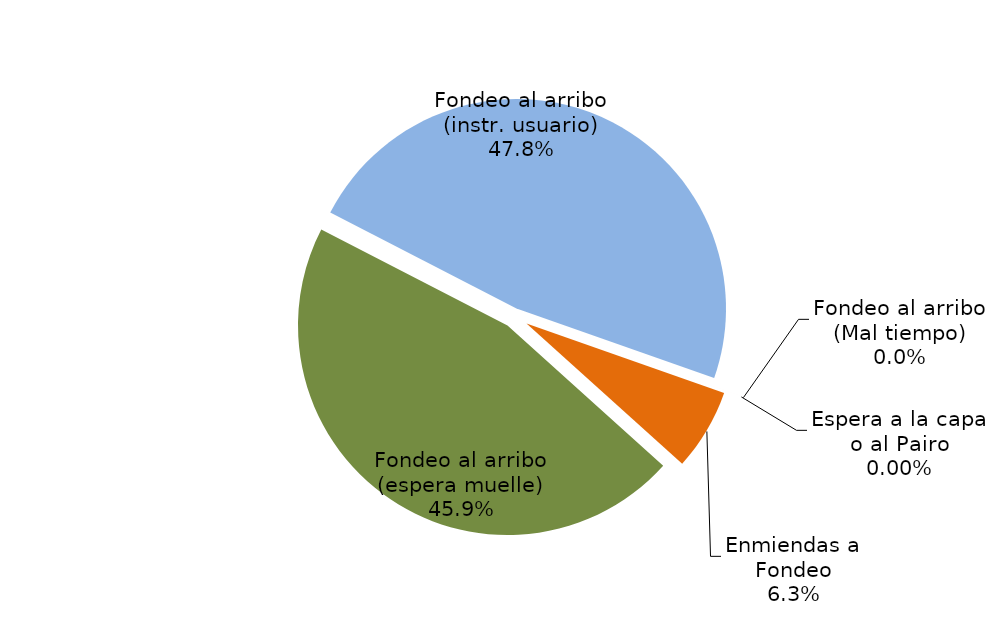
| Category | Series 0 |
|---|---|
| Fondeo al arribo (espera muelle) | 10642.541 |
| Fondeo al arribo (instr. usuario) | 11084.086 |
| Fondeo al arribo (Mal tiempo) | 0 |
| Espera a la capa o al Pairo | 0 |
| Enmiendas a Fondeo | 1457.437 |